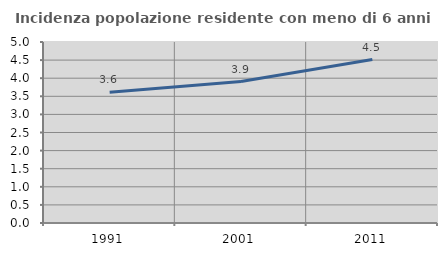
| Category | Incidenza popolazione residente con meno di 6 anni |
|---|---|
| 1991.0 | 3.615 |
| 2001.0 | 3.909 |
| 2011.0 | 4.514 |